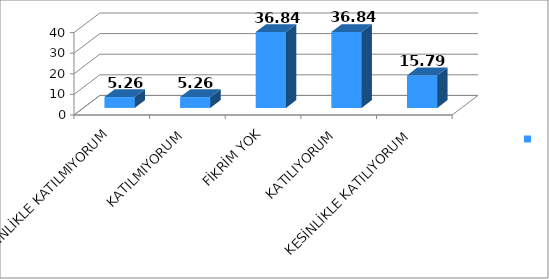
| Category | Series 0 |
|---|---|
| KESİNLİKLE KATILMIYORUM | 5.26 |
| KATILMIYORUM | 5.26 |
| FİKRİM YOK | 36.84 |
| KATILIYORUM | 36.84 |
| KESİNLİKLE KATILIYORUM | 15.79 |